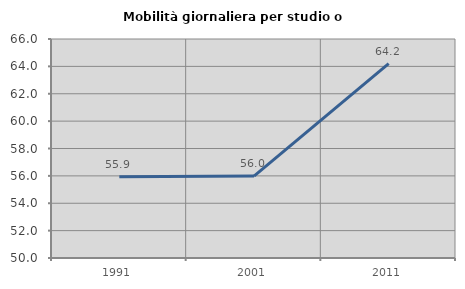
| Category | Mobilità giornaliera per studio o lavoro |
|---|---|
| 1991.0 | 55.935 |
| 2001.0 | 55.982 |
| 2011.0 | 64.206 |